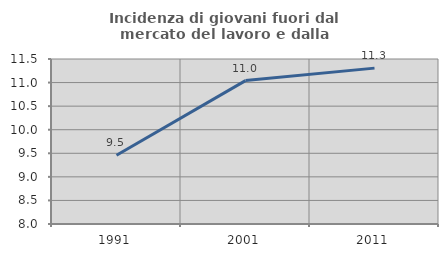
| Category | Incidenza di giovani fuori dal mercato del lavoro e dalla formazione  |
|---|---|
| 1991.0 | 9.459 |
| 2001.0 | 11.042 |
| 2011.0 | 11.307 |